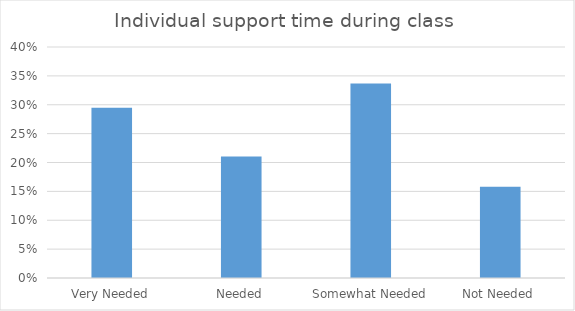
| Category | Individual support time during class  |
|---|---|
| Very Needed | 0.295 |
| Needed | 0.211 |
| Somewhat Needed | 0.337 |
| Not Needed | 0.158 |